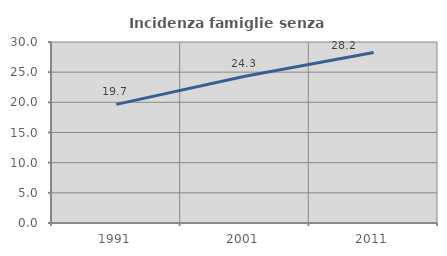
| Category | Incidenza famiglie senza nuclei |
|---|---|
| 1991.0 | 19.657 |
| 2001.0 | 24.317 |
| 2011.0 | 28.247 |